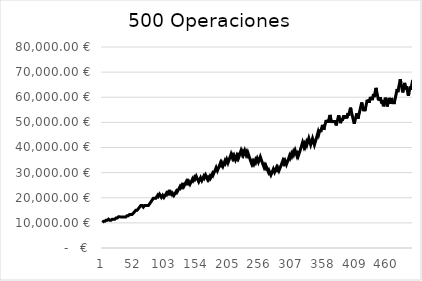
| Category | Series 0 |
|---|---|
| 0 | 10200 |
| 1 | 10404 |
| 2 | 10612.08 |
| 3 | 10824.322 |
| 4 | 10607.835 |
| 5 | 10819.992 |
| 6 | 11036.392 |
| 7 | 10815.664 |
| 8 | 11031.977 |
| 9 | 11252.617 |
| 10 | 11477.669 |
| 11 | 11248.116 |
| 12 | 11023.153 |
| 13 | 11243.616 |
| 14 | 11018.744 |
| 15 | 11239.119 |
| 16 | 11463.901 |
| 17 | 11234.623 |
| 18 | 11459.316 |
| 19 | 11688.502 |
| 20 | 11454.732 |
| 21 | 11683.827 |
| 22 | 11917.503 |
| 23 | 12155.853 |
| 24 | 11912.736 |
| 25 | 12150.991 |
| 26 | 12394.011 |
| 27 | 12641.891 |
| 28 | 12389.053 |
| 29 | 12141.272 |
| 30 | 12384.098 |
| 31 | 12631.779 |
| 32 | 12379.144 |
| 33 | 12131.561 |
| 34 | 12374.192 |
| 35 | 12621.676 |
| 36 | 12369.243 |
| 37 | 12616.627 |
| 38 | 12364.295 |
| 39 | 12611.581 |
| 40 | 12863.812 |
| 41 | 12606.536 |
| 42 | 12858.667 |
| 43 | 13115.84 |
| 44 | 13378.157 |
| 45 | 13645.72 |
| 46 | 13372.806 |
| 47 | 13105.35 |
| 48 | 13367.457 |
| 49 | 13634.806 |
| 50 | 13907.502 |
| 51 | 14185.652 |
| 52 | 14469.365 |
| 53 | 14758.752 |
| 54 | 15053.927 |
| 55 | 15355.006 |
| 56 | 15047.906 |
| 57 | 15348.864 |
| 58 | 15655.841 |
| 59 | 15968.958 |
| 60 | 16288.337 |
| 61 | 16614.104 |
| 62 | 16946.386 |
| 63 | 16607.458 |
| 64 | 16939.607 |
| 65 | 16600.815 |
| 66 | 16268.799 |
| 67 | 16594.175 |
| 68 | 16926.058 |
| 69 | 16587.537 |
| 70 | 16919.288 |
| 71 | 17257.674 |
| 72 | 16912.52 |
| 73 | 16574.27 |
| 74 | 16905.755 |
| 75 | 17243.87 |
| 76 | 17588.748 |
| 77 | 17940.523 |
| 78 | 18299.333 |
| 79 | 18665.32 |
| 80 | 19038.626 |
| 81 | 19419.399 |
| 82 | 19807.787 |
| 83 | 19411.631 |
| 84 | 19799.864 |
| 85 | 19403.866 |
| 86 | 19791.944 |
| 87 | 20187.783 |
| 88 | 20591.538 |
| 89 | 21003.369 |
| 90 | 20583.302 |
| 91 | 20994.968 |
| 92 | 21414.867 |
| 93 | 20986.57 |
| 94 | 20566.838 |
| 95 | 20155.501 |
| 96 | 20558.611 |
| 97 | 20969.784 |
| 98 | 20550.388 |
| 99 | 20139.38 |
| 100 | 20542.168 |
| 101 | 20953.011 |
| 102 | 21372.071 |
| 103 | 21799.513 |
| 104 | 21363.523 |
| 105 | 21790.793 |
| 106 | 22226.609 |
| 107 | 21782.077 |
| 108 | 22217.718 |
| 109 | 21773.364 |
| 110 | 22208.831 |
| 111 | 21764.655 |
| 112 | 21329.361 |
| 113 | 21755.949 |
| 114 | 21320.83 |
| 115 | 20894.413 |
| 116 | 21312.301 |
| 117 | 21738.547 |
| 118 | 22173.318 |
| 119 | 22616.785 |
| 120 | 22164.449 |
| 121 | 22607.738 |
| 122 | 23059.893 |
| 123 | 23521.091 |
| 124 | 23991.512 |
| 125 | 24471.343 |
| 126 | 23981.916 |
| 127 | 24461.554 |
| 128 | 24950.785 |
| 129 | 24451.77 |
| 130 | 24940.805 |
| 131 | 24441.989 |
| 132 | 24930.829 |
| 133 | 25429.445 |
| 134 | 25938.034 |
| 135 | 26456.795 |
| 136 | 25927.659 |
| 137 | 26446.212 |
| 138 | 25917.288 |
| 139 | 26435.634 |
| 140 | 25906.921 |
| 141 | 25388.782 |
| 142 | 25896.558 |
| 143 | 26414.489 |
| 144 | 26942.779 |
| 145 | 27481.635 |
| 146 | 26932.002 |
| 147 | 27470.642 |
| 148 | 28020.055 |
| 149 | 27459.654 |
| 150 | 28008.847 |
| 151 | 28569.024 |
| 152 | 27997.643 |
| 153 | 27437.69 |
| 154 | 26888.937 |
| 155 | 26351.158 |
| 156 | 26878.181 |
| 157 | 27415.745 |
| 158 | 27964.06 |
| 159 | 27404.778 |
| 160 | 26856.683 |
| 161 | 27393.816 |
| 162 | 27941.693 |
| 163 | 28500.527 |
| 164 | 27930.516 |
| 165 | 28489.126 |
| 166 | 29058.909 |
| 167 | 28477.731 |
| 168 | 27908.176 |
| 169 | 27350.013 |
| 170 | 27897.013 |
| 171 | 27339.073 |
| 172 | 27885.854 |
| 173 | 28443.571 |
| 174 | 27874.7 |
| 175 | 28432.194 |
| 176 | 29000.838 |
| 177 | 29580.854 |
| 178 | 28989.237 |
| 179 | 29569.022 |
| 180 | 30160.402 |
| 181 | 30763.611 |
| 182 | 31378.883 |
| 183 | 32006.46 |
| 184 | 31366.331 |
| 185 | 30739.005 |
| 186 | 31353.785 |
| 187 | 31980.86 |
| 188 | 32620.478 |
| 189 | 33272.887 |
| 190 | 33938.345 |
| 191 | 33259.578 |
| 192 | 33924.769 |
| 193 | 33246.274 |
| 194 | 32581.349 |
| 195 | 33232.976 |
| 196 | 33897.635 |
| 197 | 34575.588 |
| 198 | 33884.076 |
| 199 | 34561.758 |
| 200 | 35252.993 |
| 201 | 34547.933 |
| 202 | 33856.974 |
| 203 | 34534.114 |
| 204 | 35224.796 |
| 205 | 35929.292 |
| 206 | 36647.878 |
| 207 | 37380.835 |
| 208 | 36633.219 |
| 209 | 35900.554 |
| 210 | 36618.565 |
| 211 | 35886.194 |
| 212 | 36603.918 |
| 213 | 35871.84 |
| 214 | 35154.403 |
| 215 | 35857.491 |
| 216 | 36574.641 |
| 217 | 35843.148 |
| 218 | 36560.011 |
| 219 | 35828.811 |
| 220 | 36545.387 |
| 221 | 37276.294 |
| 222 | 38021.82 |
| 223 | 38782.257 |
| 224 | 38006.612 |
| 225 | 37246.479 |
| 226 | 37991.409 |
| 227 | 37231.581 |
| 228 | 37976.212 |
| 229 | 38735.737 |
| 230 | 37961.022 |
| 231 | 37201.801 |
| 232 | 37945.838 |
| 233 | 37186.921 |
| 234 | 37930.659 |
| 235 | 37172.046 |
| 236 | 36428.605 |
| 237 | 35700.033 |
| 238 | 34986.032 |
| 239 | 34286.312 |
| 240 | 33600.585 |
| 241 | 34272.597 |
| 242 | 33587.145 |
| 243 | 34258.888 |
| 244 | 33573.71 |
| 245 | 34245.185 |
| 246 | 34930.088 |
| 247 | 34231.486 |
| 248 | 34916.116 |
| 249 | 35614.439 |
| 250 | 34902.15 |
| 251 | 34204.107 |
| 252 | 34888.189 |
| 253 | 35585.953 |
| 254 | 36297.672 |
| 255 | 35571.718 |
| 256 | 34860.284 |
| 257 | 34163.078 |
| 258 | 33479.817 |
| 259 | 32810.22 |
| 260 | 32154.016 |
| 261 | 32797.096 |
| 262 | 32141.154 |
| 263 | 32783.977 |
| 264 | 32128.298 |
| 265 | 31485.732 |
| 266 | 30856.017 |
| 267 | 30238.897 |
| 268 | 30843.675 |
| 269 | 30226.801 |
| 270 | 29622.265 |
| 271 | 29029.82 |
| 272 | 29610.416 |
| 273 | 30202.625 |
| 274 | 30806.677 |
| 275 | 31422.811 |
| 276 | 30794.355 |
| 277 | 30178.468 |
| 278 | 30782.037 |
| 279 | 31397.678 |
| 280 | 32025.631 |
| 281 | 31385.119 |
| 282 | 32012.821 |
| 283 | 31372.564 |
| 284 | 30745.113 |
| 285 | 31360.015 |
| 286 | 31987.216 |
| 287 | 32626.96 |
| 288 | 33279.499 |
| 289 | 33945.089 |
| 290 | 34623.991 |
| 291 | 33931.511 |
| 292 | 34610.141 |
| 293 | 33917.939 |
| 294 | 34596.297 |
| 295 | 33904.371 |
| 296 | 33226.284 |
| 297 | 33890.81 |
| 298 | 34568.626 |
| 299 | 35259.998 |
| 300 | 35965.198 |
| 301 | 36684.502 |
| 302 | 35950.812 |
| 303 | 36669.829 |
| 304 | 37403.225 |
| 305 | 36655.161 |
| 306 | 37388.264 |
| 307 | 38136.029 |
| 308 | 37373.309 |
| 309 | 38120.775 |
| 310 | 38883.19 |
| 311 | 38105.526 |
| 312 | 37343.416 |
| 313 | 36596.548 |
| 314 | 37328.478 |
| 315 | 36581.909 |
| 316 | 37313.547 |
| 317 | 38059.818 |
| 318 | 38821.014 |
| 319 | 39597.435 |
| 320 | 40389.383 |
| 321 | 41197.171 |
| 322 | 42021.114 |
| 323 | 41180.692 |
| 324 | 40357.078 |
| 325 | 41164.22 |
| 326 | 40340.936 |
| 327 | 41147.754 |
| 328 | 41970.709 |
| 329 | 41131.295 |
| 330 | 41953.921 |
| 331 | 42792.999 |
| 332 | 43648.859 |
| 333 | 42775.882 |
| 334 | 41920.365 |
| 335 | 41081.957 |
| 336 | 41903.596 |
| 337 | 42741.668 |
| 338 | 43596.502 |
| 339 | 42724.572 |
| 340 | 41870.08 |
| 341 | 41032.679 |
| 342 | 41853.332 |
| 343 | 42690.399 |
| 344 | 43544.207 |
| 345 | 44415.091 |
| 346 | 45303.393 |
| 347 | 46209.461 |
| 348 | 45285.271 |
| 349 | 46190.977 |
| 350 | 47114.796 |
| 351 | 46172.501 |
| 352 | 47095.951 |
| 353 | 48037.87 |
| 354 | 48998.627 |
| 355 | 48018.654 |
| 356 | 47058.281 |
| 357 | 47999.447 |
| 358 | 48959.436 |
| 359 | 49938.625 |
| 360 | 50937.397 |
| 361 | 49918.649 |
| 362 | 50917.022 |
| 363 | 49898.682 |
| 364 | 50896.655 |
| 365 | 51914.588 |
| 366 | 52952.88 |
| 367 | 51893.823 |
| 368 | 50855.946 |
| 369 | 49838.827 |
| 370 | 50835.604 |
| 371 | 49818.892 |
| 372 | 50815.269 |
| 373 | 49798.964 |
| 374 | 50794.943 |
| 375 | 49779.045 |
| 376 | 48783.464 |
| 377 | 49759.133 |
| 378 | 50754.316 |
| 379 | 51769.402 |
| 380 | 52804.79 |
| 381 | 51748.694 |
| 382 | 50713.72 |
| 383 | 49699.446 |
| 384 | 50693.435 |
| 385 | 51707.303 |
| 386 | 50673.157 |
| 387 | 51686.621 |
| 388 | 52720.353 |
| 389 | 51665.946 |
| 390 | 52699.265 |
| 391 | 51645.279 |
| 392 | 52678.185 |
| 393 | 51624.621 |
| 394 | 52657.114 |
| 395 | 53710.256 |
| 396 | 52636.051 |
| 397 | 53688.772 |
| 398 | 54762.547 |
| 399 | 55857.798 |
| 400 | 54740.642 |
| 401 | 53645.83 |
| 402 | 52572.913 |
| 403 | 51521.455 |
| 404 | 50491.026 |
| 405 | 49481.205 |
| 406 | 50470.829 |
| 407 | 51480.246 |
| 408 | 52509.851 |
| 409 | 53560.048 |
| 410 | 52488.847 |
| 411 | 51439.07 |
| 412 | 52467.851 |
| 413 | 53517.208 |
| 414 | 54587.552 |
| 415 | 55679.303 |
| 416 | 56792.89 |
| 417 | 57928.747 |
| 418 | 56770.172 |
| 419 | 55634.769 |
| 420 | 54522.074 |
| 421 | 55612.515 |
| 422 | 54500.265 |
| 423 | 55590.27 |
| 424 | 56702.075 |
| 425 | 57836.117 |
| 426 | 58992.839 |
| 427 | 57812.982 |
| 428 | 58969.242 |
| 429 | 57789.857 |
| 430 | 58945.654 |
| 431 | 60124.568 |
| 432 | 58922.076 |
| 433 | 60100.518 |
| 434 | 58898.507 |
| 435 | 60076.477 |
| 436 | 61278.007 |
| 437 | 60052.447 |
| 438 | 61253.496 |
| 439 | 62478.566 |
| 440 | 63728.137 |
| 441 | 62453.574 |
| 442 | 61204.503 |
| 443 | 59980.413 |
| 444 | 58780.805 |
| 445 | 59956.421 |
| 446 | 58757.292 |
| 447 | 59932.438 |
| 448 | 58733.789 |
| 449 | 57559.113 |
| 450 | 58710.296 |
| 451 | 57536.09 |
| 452 | 56385.368 |
| 453 | 57513.075 |
| 454 | 58663.337 |
| 455 | 59836.604 |
| 456 | 58639.872 |
| 457 | 57467.074 |
| 458 | 56317.733 |
| 459 | 57444.087 |
| 460 | 58592.969 |
| 461 | 59764.828 |
| 462 | 58569.532 |
| 463 | 57398.141 |
| 464 | 58546.104 |
| 465 | 59717.026 |
| 466 | 58522.686 |
| 467 | 57352.232 |
| 468 | 58499.277 |
| 469 | 57329.291 |
| 470 | 58475.877 |
| 471 | 59645.394 |
| 472 | 60838.302 |
| 473 | 62055.068 |
| 474 | 63296.17 |
| 475 | 62030.246 |
| 476 | 63270.851 |
| 477 | 64536.268 |
| 478 | 65826.994 |
| 479 | 67143.533 |
| 480 | 65800.663 |
| 481 | 64484.65 |
| 482 | 63194.957 |
| 483 | 61931.057 |
| 484 | 63169.679 |
| 485 | 64433.072 |
| 486 | 65721.734 |
| 487 | 64407.299 |
| 488 | 63119.153 |
| 489 | 64381.536 |
| 490 | 63093.905 |
| 491 | 61832.027 |
| 492 | 60595.387 |
| 493 | 61807.294 |
| 494 | 63043.44 |
| 495 | 64304.309 |
| 496 | 63018.223 |
| 497 | 64278.587 |
| 498 | 65564.159 |
| 499 | 66875.442 |